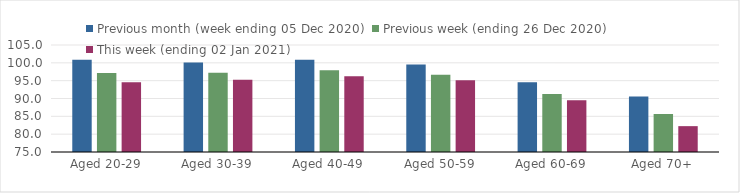
| Category | Previous month (week ending 05 Dec 2020) | Previous week (ending 26 Dec 2020) | This week (ending 02 Jan 2021) |
|---|---|---|---|
| Aged 20-29 | 100.85 | 97.13 | 94.56 |
| Aged 30-39 | 100.09 | 97.22 | 95.26 |
| Aged 40-49 | 100.84 | 97.91 | 96.24 |
| Aged 50-59 | 99.54 | 96.64 | 95.11 |
| Aged 60-69 | 94.58 | 91.28 | 89.52 |
| Aged 70+ | 90.53 | 85.66 | 82.25 |